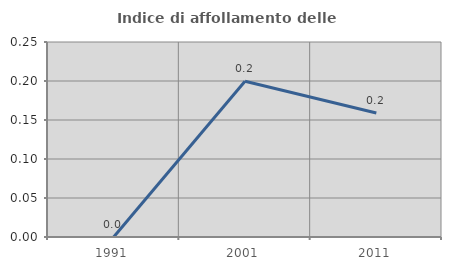
| Category | Indice di affollamento delle abitazioni  |
|---|---|
| 1991.0 | 0 |
| 2001.0 | 0.2 |
| 2011.0 | 0.159 |